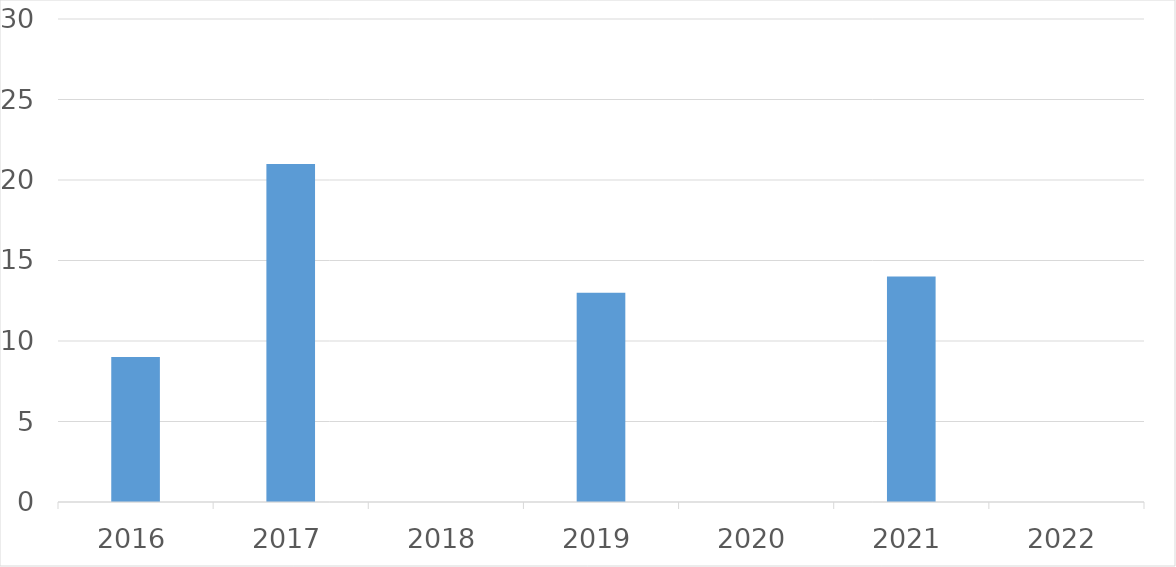
| Category | Series 0 |
|---|---|
| 2016 | 9 |
| 2017 | 21 |
| 2018 | 0 |
| 2019 | 13 |
| 2020 | 0 |
| 2021 | 14 |
| 2022 | 0 |